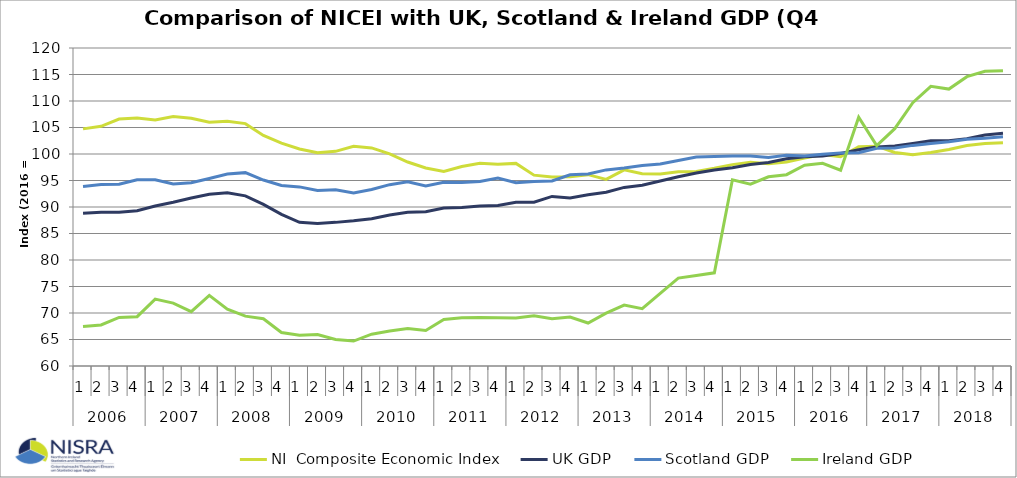
| Category | NI  | UK | Scotland | Ireland |
|---|---|---|---|---|
| 0 | 104.74 | 88.8 | 93.874 | 67.458 |
| 1 | 105.224 | 89 | 94.227 | 67.737 |
| 2 | 106.601 | 89 | 94.31 | 69.171 |
| 3 | 106.773 | 89.3 | 95.146 | 69.303 |
| 4 | 106.439 | 90.2 | 95.146 | 72.622 |
| 5 | 107.054 | 90.9 | 94.328 | 71.873 |
| 6 | 106.755 | 91.7 | 94.577 | 70.256 |
| 7 | 105.997 | 92.4 | 95.365 | 73.316 |
| 8 | 106.165 | 92.7 | 96.216 | 70.731 |
| 9 | 105.73 | 92.1 | 96.484 | 69.407 |
| 10 | 103.503 | 90.5 | 95.091 | 68.924 |
| 11 | 102.055 | 88.6 | 94.07 | 66.316 |
| 12 | 100.941 | 87.1 | 93.795 | 65.807 |
| 13 | 100.229 | 86.9 | 93.098 | 65.933 |
| 14 | 100.505 | 87.1 | 93.237 | 65.011 |
| 15 | 101.469 | 87.4 | 92.646 | 64.707 |
| 16 | 101.153 | 87.8 | 93.315 | 66.008 |
| 17 | 100.041 | 88.5 | 94.217 | 66.596 |
| 18 | 98.492 | 89 | 94.757 | 67.073 |
| 19 | 97.368 | 89.1 | 93.985 | 66.693 |
| 20 | 96.703 | 89.8 | 94.655 | 68.792 |
| 21 | 97.633 | 89.9 | 94.6 | 69.081 |
| 22 | 98.253 | 90.2 | 94.794 | 69.168 |
| 23 | 98.057 | 90.3 | 95.446 | 69.127 |
| 24 | 98.23 | 90.9 | 94.597 | 69.053 |
| 25 | 96.007 | 90.9 | 94.825 | 69.495 |
| 26 | 95.656 | 92 | 94.909 | 68.908 |
| 27 | 95.704 | 91.7 | 96.083 | 69.243 |
| 28 | 96.1 | 92.3 | 96.221 | 68.113 |
| 29 | 95.214 | 92.8 | 97 | 69.978 |
| 30 | 97.01 | 93.7 | 97.345 | 71.502 |
| 31 | 96.264 | 94.1 | 97.812 | 70.81 |
| 32 | 96.231 | 94.9 | 98.107 | 73.69 |
| 33 | 96.653 | 95.7 | 98.783 | 76.577 |
| 34 | 96.721 | 96.4 | 99.448 | 77.091 |
| 35 | 97.317 | 97 | 99.542 | 77.586 |
| 36 | 97.999 | 97.4 | 99.622 | 95.13 |
| 37 | 98.441 | 98 | 99.599 | 94.303 |
| 38 | 98.151 | 98.4 | 99.319 | 95.699 |
| 39 | 98.48 | 99.1 | 99.773 | 96.098 |
| 40 | 99.241 | 99.5 | 99.603 | 97.87 |
| 41 | 99.915 | 99.6 | 99.942 | 98.25 |
| 42 | 99.469 | 100.1 | 100.212 | 96.944 |
| 43 | 101.376 | 100.8 | 100.243 | 106.936 |
| 44 | 101.479 | 101.3 | 101.07 | 101.577 |
| 45 | 100.284 | 101.5 | 101.15 | 104.771 |
| 46 | 99.85 | 102 | 101.626 | 109.674 |
| 47 | 100.274 | 102.5 | 101.97 | 112.776 |
| 48 | 100.841 | 102.5 | 102.333 | 112.252 |
| 49 | 101.602 | 102.9 | 102.797 | 114.595 |
| 50 | 101.962 | 103.6 | 102.987 | 115.606 |
| 51 | 102.137 | 103.9 | 103.256 | 115.7 |